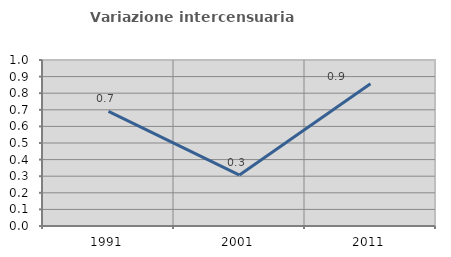
| Category | Variazione intercensuaria annua |
|---|---|
| 1991.0 | 0.69 |
| 2001.0 | 0.307 |
| 2011.0 | 0.857 |